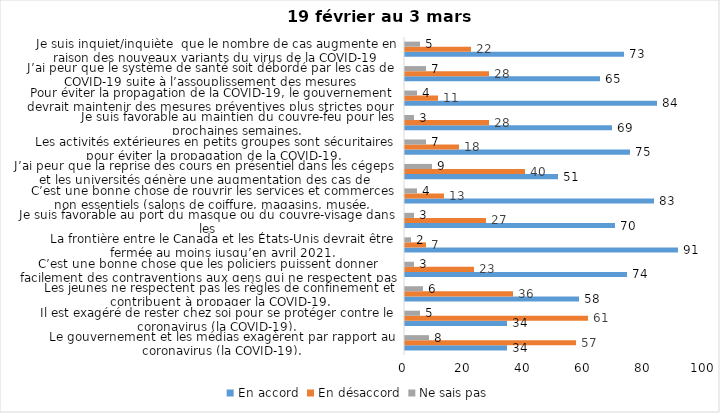
| Category | En accord | En désaccord | Ne sais pas |
|---|---|---|---|
| Le gouvernement et les médias exagèrent par rapport au coronavirus (la COVID-19). | 34 | 57 | 8 |
| Il est exagéré de rester chez soi pour se protéger contre le coronavirus (la COVID-19). | 34 | 61 | 5 |
| Les jeunes ne respectent pas les règles de confinement et contribuent à propager la COVID-19. | 58 | 36 | 6 |
| C’est une bonne chose que les policiers puissent donner facilement des contraventions aux gens qui ne respectent pas les mesures pour prévenir le coronavirus (la COVID-19). | 74 | 23 | 3 |
| La frontière entre le Canada et les États-Unis devrait être fermée au moins jusqu’en avril 2021. | 91 | 7 | 2 |
| Je suis favorable au port du masque ou du couvre-visage dans les
lieux publics extérieurs achalandés (ex. rues, parcs) | 70 | 27 | 3 |
| C’est une bonne chose de rouvrir les services et commerces non essentiels (salons de coiffure, magasins, musée, industries) à partir du 8 février 2021. | 83 | 13 | 4 |
| J’ai peur que la reprise des cours en présentiel dans les cégeps et les universités génère une augmentation des cas de COVID-19. | 51 | 40 | 9 |
| Les activités extérieures en petits groupes sont sécuritaires pour éviter la propagation de la COVID-19. | 75 | 18 | 7 |
| Je suis favorable au maintien du couvre-feu pour les prochaines semaines. | 69 | 28 | 3 |
| Pour éviter la propagation de la COVID-19, le gouvernement devrait maintenir des mesures préventives plus strictes pour la grande région de Montréal. | 84 | 11 | 4 |
| J’ai peur que le système de santé soit débordé par les cas de COVID-19 suite à l’assouplissement des mesures | 65 | 28 | 7 |
| Je suis inquiet/inquiète  que le nombre de cas augmente en raison des nouveaux variants du virus de la COVID-19 | 73 | 22 | 5 |